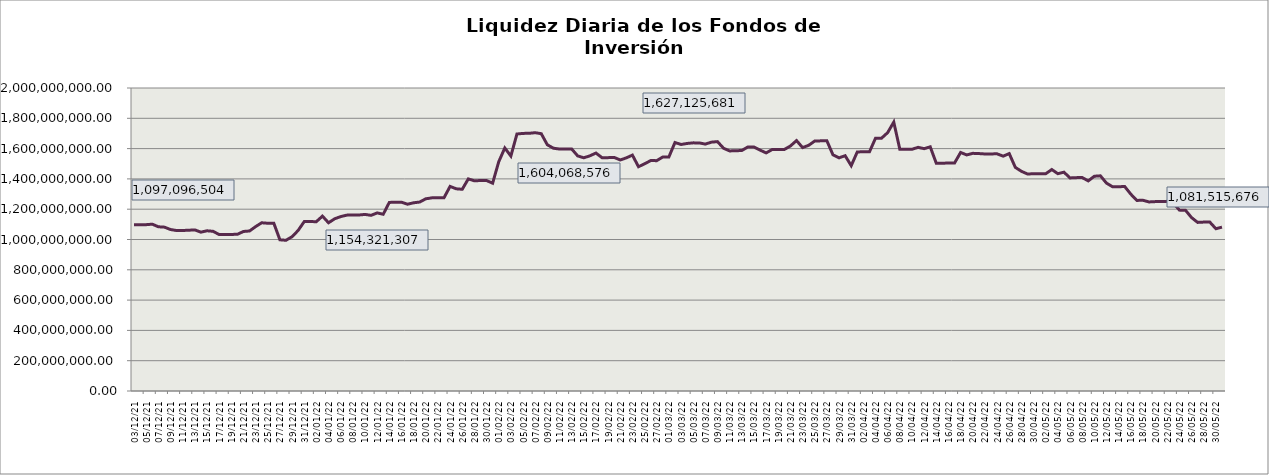
| Category | Series 0 |
|---|---|
| 2021-12-03 | 1097096504.23 |
| 2021-12-04 | 1097996654.74 |
| 2021-12-05 | 1097917876.31 |
| 2021-12-06 | 1101192707.49 |
| 2021-12-07 | 1083966651.18 |
| 2021-12-08 | 1081607449.06 |
| 2021-12-09 | 1065774901.45 |
| 2021-12-10 | 1059124106.75 |
| 2021-12-11 | 1059480620.59 |
| 2021-12-12 | 1061270295.39 |
| 2021-12-13 | 1063403215.99 |
| 2021-12-14 | 1048437941.64 |
| 2021-12-15 | 1057485173.03 |
| 2021-12-16 | 1054099273.42 |
| 2021-12-17 | 1032773255.96 |
| 2021-12-18 | 1033656397.81 |
| 2021-12-19 | 1033548615.64 |
| 2021-12-20 | 1034218643.7 |
| 2021-12-21 | 1052979737.2 |
| 2021-12-22 | 1056191426.75 |
| 2021-12-23 | 1084883054.88 |
| 2021-12-24 | 1110399629.2 |
| 2021-12-25 | 1107288584.62 |
| 2021-12-26 | 1107170462.61 |
| 2021-12-27 | 997940277.15 |
| 2021-12-28 | 994841337.09 |
| 2021-12-29 | 1018284337.53 |
| 2021-12-30 | 1059829379.82 |
| 2021-12-31 | 1118111842.11 |
| 2022-01-01 | 1117994682.84 |
| 2022-01-02 | 1117950417 |
| 2022-01-03 | 1154321307.13 |
| 2022-01-04 | 1110265892.88 |
| 2022-01-05 | 1136579384.02 |
| 2022-01-06 | 1151142579.57 |
| 2022-01-07 | 1160855176.15 |
| 2022-01-08 | 1161217804.82 |
| 2022-01-09 | 1161679635.87 |
| 2022-01-10 | 1165501303.2 |
| 2022-01-11 | 1159476489.39 |
| 2022-01-12 | 1175489166.61 |
| 2022-01-13 | 1166582592.91 |
| 2022-01-14 | 1244712527.53 |
| 2022-01-15 | 1246194702.97 |
| 2022-01-16 | 1246081679.68 |
| 2022-01-17 | 1232928986.26 |
| 2022-01-18 | 1242379187.08 |
| 2022-01-19 | 1247220878.04 |
| 2022-01-20 | 1268568342.96 |
| 2022-01-21 | 1274883161.26 |
| 2022-01-22 | 1275770675.9 |
| 2022-01-23 | 1275667885.61 |
| 2022-01-24 | 1350500082 |
| 2022-01-25 | 1334702718.69 |
| 2022-01-26 | 1331451522.26 |
| 2022-01-27 | 1400028360.02 |
| 2022-01-28 | 1387277518.16 |
| 2022-01-29 | 1389328724.63 |
| 2022-01-30 | 1389207094.8 |
| 2022-01-31 | 1371706237.42 |
| 2022-02-01 | 1512627365.38 |
| 2022-02-02 | 1604068575.79 |
| 2022-02-03 | 1550719956.14 |
| 2022-02-04 | 1696317803.64 |
| 2022-02-05 | 1700328057.4 |
| 2022-02-06 | 1700985628.54 |
| 2022-02-07 | 1704910575.07 |
| 2022-02-08 | 1698531798.52 |
| 2022-02-09 | 1625222400.08 |
| 2022-02-10 | 1602582990.27 |
| 2022-02-11 | 1597092768.78 |
| 2022-02-12 | 1597968677.64 |
| 2022-02-13 | 1597829452.86 |
| 2022-02-14 | 1551647529.97 |
| 2022-02-15 | 1539225551.72 |
| 2022-02-16 | 1552378845.55 |
| 2022-02-17 | 1570678303.5 |
| 2022-02-18 | 1539949941.53 |
| 2022-02-19 | 1540326477.3 |
| 2022-02-20 | 1541749967.27 |
| 2022-02-21 | 1524896584.23 |
| 2022-02-22 | 1538831955.01 |
| 2022-02-23 | 1557005988.54 |
| 2022-02-24 | 1480376623.92 |
| 2022-02-25 | 1499590303.94 |
| 2022-02-26 | 1520719611.79 |
| 2022-02-27 | 1520581036.01 |
| 2022-02-28 | 1544755907.74 |
| 2022-03-01 | 1544848151.61 |
| 2022-03-02 | 1640223680.56 |
| 2022-03-03 | 1627125680.52 |
| 2022-03-04 | 1634030107.24 |
| 2022-03-05 | 1637794787.65 |
| 2022-03-06 | 1637657780.32 |
| 2022-03-07 | 1629719943.57 |
| 2022-03-08 | 1642571650.7 |
| 2022-03-09 | 1645956959.43 |
| 2022-03-10 | 1602086175.79 |
| 2022-03-11 | 1584659006.19 |
| 2022-03-12 | 1585794704.67 |
| 2022-03-13 | 1587405116.43 |
| 2022-03-14 | 1610930761.64 |
| 2022-03-15 | 1610029704.34 |
| 2022-03-16 | 1590149206.2 |
| 2022-03-17 | 1571504796.08 |
| 2022-03-18 | 1594030659.65 |
| 2022-03-19 | 1594440489.42 |
| 2022-03-20 | 1594343383.83 |
| 2022-03-21 | 1617308499.21 |
| 2022-03-22 | 1652988300.9 |
| 2022-03-23 | 1606653263.62 |
| 2022-03-24 | 1621580537.82 |
| 2022-03-25 | 1650091626.14 |
| 2022-03-26 | 1651130015.14 |
| 2022-03-27 | 1651174979.25 |
| 2022-03-28 | 1558608517.51 |
| 2022-03-29 | 1539091666.79 |
| 2022-03-30 | 1553085356.09 |
| 2022-03-31 | 1487267249.78 |
| 2022-04-01 | 1578183686.63 |
| 2022-04-02 | 1578660381.28 |
| 2022-04-03 | 1578541483.98 |
| 2022-04-04 | 1668571643.95 |
| 2022-04-05 | 1669085084.4 |
| 2022-04-06 | 1705723256.62 |
| 2022-04-07 | 1774945198.59 |
| 2022-04-08 | 1595134260.01 |
| 2022-04-09 | 1595231352.81 |
| 2022-04-10 | 1595405884.47 |
| 2022-04-11 | 1608318340.17 |
| 2022-04-12 | 1599505193.48 |
| 2022-04-13 | 1611736127.24 |
| 2022-04-14 | 1502971651.12 |
| 2022-04-15 | 1503818109.56 |
| 2022-04-16 | 1504445158.75 |
| 2022-04-17 | 1504642196.74 |
| 2022-04-18 | 1574506198.38 |
| 2022-04-19 | 1558175622.34 |
| 2022-04-20 | 1568696953.02 |
| 2022-04-21 | 1567241058.62 |
| 2022-04-22 | 1564518341.38 |
| 2022-04-23 | 1564985142.12 |
| 2022-04-24 | 1565423522.35 |
| 2022-04-25 | 1550110210.2 |
| 2022-04-26 | 1566997966.53 |
| 2022-04-27 | 1476114550.75 |
| 2022-04-28 | 1450199682.85 |
| 2022-04-29 | 1432519659.99 |
| 2022-04-30 | 1433829580.9 |
| 2022-05-01 | 1434074183.34 |
| 2022-05-02 | 1433960883.01 |
| 2022-05-03 | 1461842234.31 |
| 2022-05-04 | 1434257037.72 |
| 2022-05-05 | 1444398489.9 |
| 2022-05-06 | 1406333110.39 |
| 2022-05-07 | 1408349447.61 |
| 2022-05-08 | 1408880524.86 |
| 2022-05-09 | 1386903927.65 |
| 2022-05-10 | 1417602102.62 |
| 2022-05-11 | 1420406906.89 |
| 2022-05-12 | 1372008238.12 |
| 2022-05-13 | 1347970098.12 |
| 2022-05-14 | 1348411643.64 |
| 2022-05-15 | 1349712326.06 |
| 2022-05-16 | 1299351421.2 |
| 2022-05-17 | 1257988494.6 |
| 2022-05-18 | 1258906968.55 |
| 2022-05-19 | 1247945322.79 |
| 2022-05-20 | 1250020174.11 |
| 2022-05-21 | 1250841487.48 |
| 2022-05-22 | 1251740270.14 |
| 2022-05-23 | 1240464211.53 |
| 2022-05-24 | 1193896218.32 |
| 2022-05-25 | 1193192863.77 |
| 2022-05-26 | 1144476562.99 |
| 2022-05-27 | 1112839370.97 |
| 2022-05-28 | 1114883073.38 |
| 2022-05-29 | 1114856069.7 |
| 2022-05-30 | 1071207844.96 |
| 2022-05-31 | 1081515675.87 |